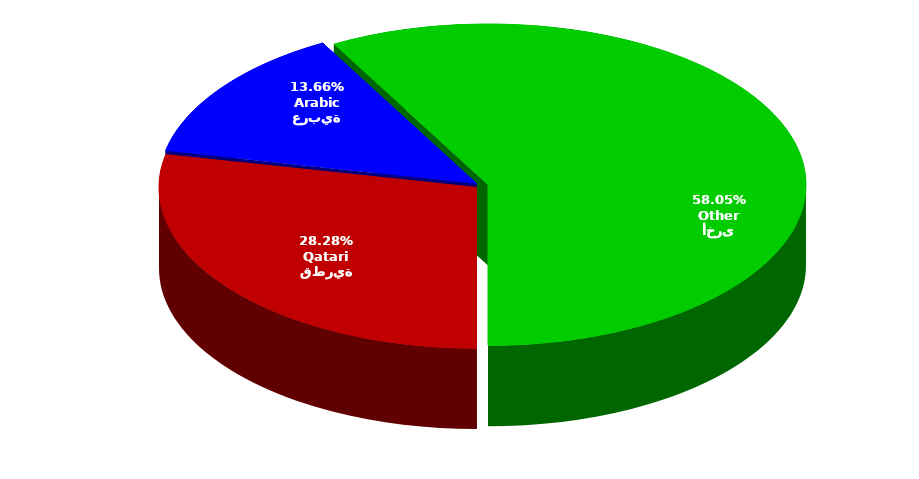
| Category | Series 0 |
|---|---|
| قطرية
Qatari | 86284 |
| عربية
Arabic | 41689 |
| أخرى
Other | 177114 |